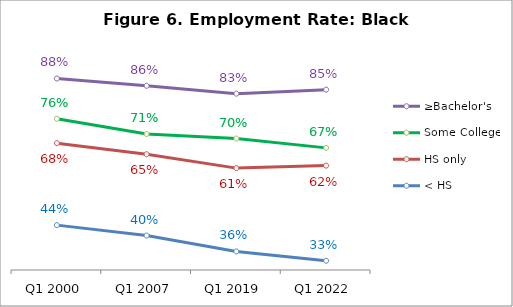
| Category | ≥Bachelor's | Some College | HS only | < HS |
|---|---|---|---|---|
| Q1 2000 | 0.88 | 0.758 | 0.684 | 0.436 |
| Q1 2007 | 0.858 | 0.712 | 0.651 | 0.404 |
| Q1 2019 | 0.834 | 0.698 | 0.609 | 0.356 |
| Q1 2022 | 0.847 | 0.67 | 0.616 | 0.328 |